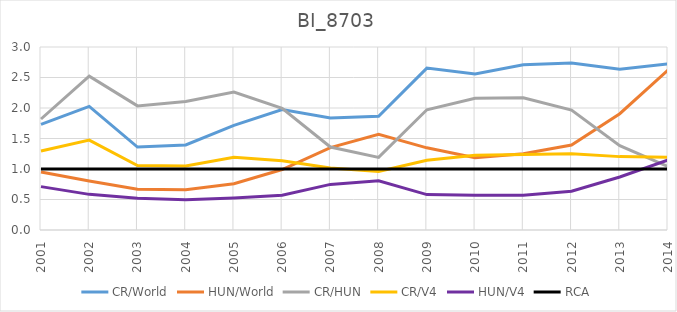
| Category | CR/World | HUN/World | CR/HUN | CR/V4 | HUN/V4 | RCA |
|---|---|---|---|---|---|---|
| 2001.0 | 1.732 | 0.952 | 1.82 | 1.294 | 0.711 | 1 |
| 2002.0 | 2.025 | 0.803 | 2.522 | 1.473 | 0.584 | 1 |
| 2003.0 | 1.359 | 0.668 | 2.035 | 1.057 | 0.519 | 1 |
| 2004.0 | 1.394 | 0.661 | 2.108 | 1.048 | 0.497 | 1 |
| 2005.0 | 1.714 | 0.758 | 2.262 | 1.191 | 0.526 | 1 |
| 2006.0 | 1.976 | 0.992 | 1.993 | 1.134 | 0.569 | 1 |
| 2007.0 | 1.837 | 1.35 | 1.36 | 1.017 | 0.748 | 1 |
| 2008.0 | 1.865 | 1.567 | 1.19 | 0.959 | 0.806 | 1 |
| 2009.0 | 2.655 | 1.347 | 1.971 | 1.144 | 0.58 | 1 |
| 2010.0 | 2.559 | 1.185 | 2.16 | 1.226 | 0.568 | 1 |
| 2011.0 | 2.708 | 1.249 | 2.169 | 1.238 | 0.571 | 1 |
| 2012.0 | 2.739 | 1.394 | 1.965 | 1.251 | 0.637 | 1 |
| 2013.0 | 2.637 | 1.907 | 1.383 | 1.203 | 0.87 | 1 |
| 2014.0 | 2.724 | 2.621 | 1.039 | 1.193 | 1.148 | 1 |